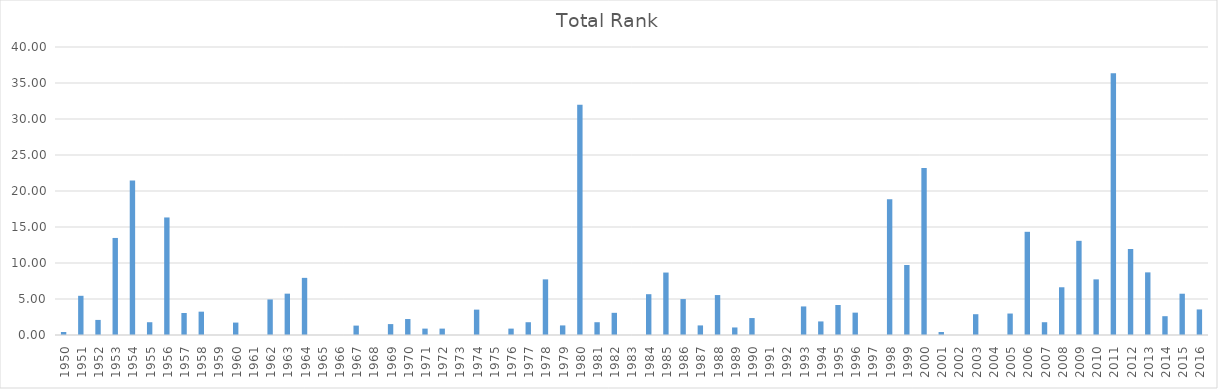
| Category | Total Rank |
|---|---|
| 1950.0 | 0.419 |
| 1951.0 | 5.444 |
| 1952.0 | 2.094 |
| 1953.0 | 13.479 |
| 1954.0 | 21.465 |
| 1955.0 | 1.775 |
| 1956.0 | 16.325 |
| 1957.0 | 3.056 |
| 1958.0 | 3.24 |
| 1959.0 | 0 |
| 1960.0 | 1.725 |
| 1961.0 | 0 |
| 1962.0 | 4.94 |
| 1963.0 | 5.742 |
| 1964.0 | 7.936 |
| 1965.0 | 0 |
| 1966.0 | 0 |
| 1967.0 | 1.306 |
| 1968.0 | 0 |
| 1969.0 | 1.515 |
| 1970.0 | 2.218 |
| 1971.0 | 0.887 |
| 1972.0 | 0.887 |
| 1973.0 | 0 |
| 1974.0 | 3.524 |
| 1975.0 | 0 |
| 1976.0 | 0.887 |
| 1977.0 | 1.775 |
| 1978.0 | 7.726 |
| 1979.0 | 1.331 |
| 1980.0 | 31.996 |
| 1981.0 | 1.775 |
| 1982.0 | 3.081 |
| 1983.0 | 0 |
| 1984.0 | 5.668 |
| 1985.0 | 8.674 |
| 1986.0 | 4.99 |
| 1987.0 | 1.331 |
| 1988.0 | 5.549 |
| 1989.0 | 1.047 |
| 1990.0 | 2.353 |
| 1991.0 | 0 |
| 1992.0 | 0 |
| 1993.0 | 3.968 |
| 1994.0 | 1.884 |
| 1995.0 | 4.168 |
| 1996.0 | 3.106 |
| 1997.0 | 0 |
| 1998.0 | 18.841 |
| 1999.0 | 9.726 |
| 2000.0 | 23.201 |
| 2001.0 | 0.419 |
| 2002.0 | 0 |
| 2003.0 | 2.887 |
| 2004.0 | 0 |
| 2005.0 | 2.981 |
| 2006.0 | 14.331 |
| 2007.0 | 1.775 |
| 2008.0 | 6.63 |
| 2009.0 | 13.081 |
| 2010.0 | 7.726 |
| 2011.0 | 36.34 |
| 2012.0 | 11.945 |
| 2013.0 | 8.699 |
| 2014.0 | 2.612 |
| 2015.0 | 5.734 |
| 2016.0 | 3.549 |